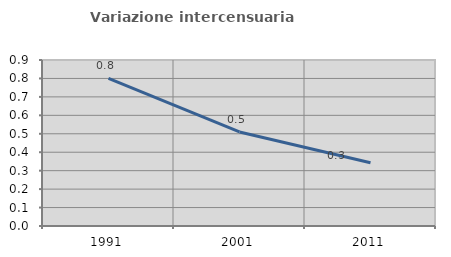
| Category | Variazione intercensuaria annua |
|---|---|
| 1991.0 | 0.8 |
| 2001.0 | 0.51 |
| 2011.0 | 0.343 |